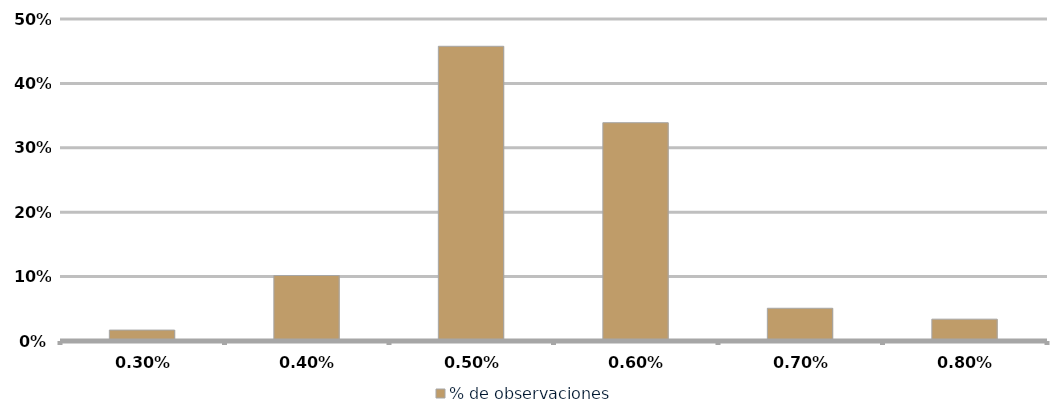
| Category | % de observaciones  |
|---|---|
| 0.003 | 0.017 |
| 0.004 | 0.102 |
| 0.005 | 0.458 |
| 0.006 | 0.339 |
| 0.007 | 0.051 |
| 0.008 | 0.034 |